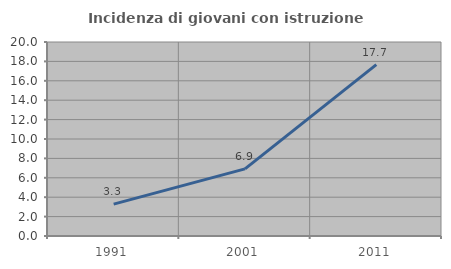
| Category | Incidenza di giovani con istruzione universitaria |
|---|---|
| 1991.0 | 3.291 |
| 2001.0 | 6.919 |
| 2011.0 | 17.675 |